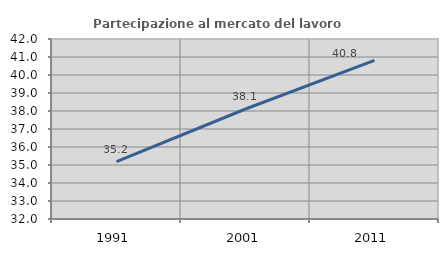
| Category | Partecipazione al mercato del lavoro  femminile |
|---|---|
| 1991.0 | 35.182 |
| 2001.0 | 38.111 |
| 2011.0 | 40.81 |